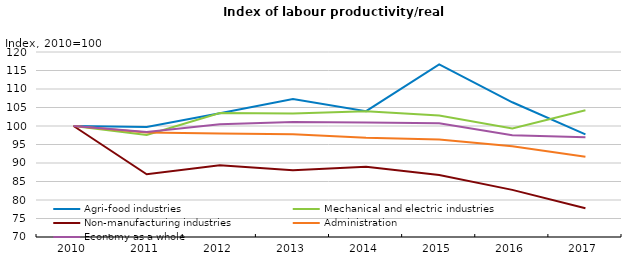
| Category | Agri-food industries | Mechanical and electric industries | Non-manufacturing industries | Administration | Economy as a whole |
|---|---|---|---|---|---|
| 2010.0 | 100 | 100 | 100 | 100 | 100 |
| 2011.0 | 99.747 | 97.553 | 86.965 | 98.27 | 98.37 |
| 2012.0 | 103.467 | 103.534 | 89.375 | 97.973 | 100.453 |
| 2013.0 | 107.29 | 103.375 | 88.025 | 97.777 | 101.087 |
| 2014.0 | 104.005 | 104.011 | 88.977 | 96.822 | 100.944 |
| 2015.0 | 116.654 | 102.846 | 86.78 | 96.335 | 100.749 |
| 2016.0 | 106.409 | 99.317 | 82.74 | 94.557 | 97.472 |
| 2017.0 | 97.723 | 104.245 | 77.751 | 91.666 | 96.977 |